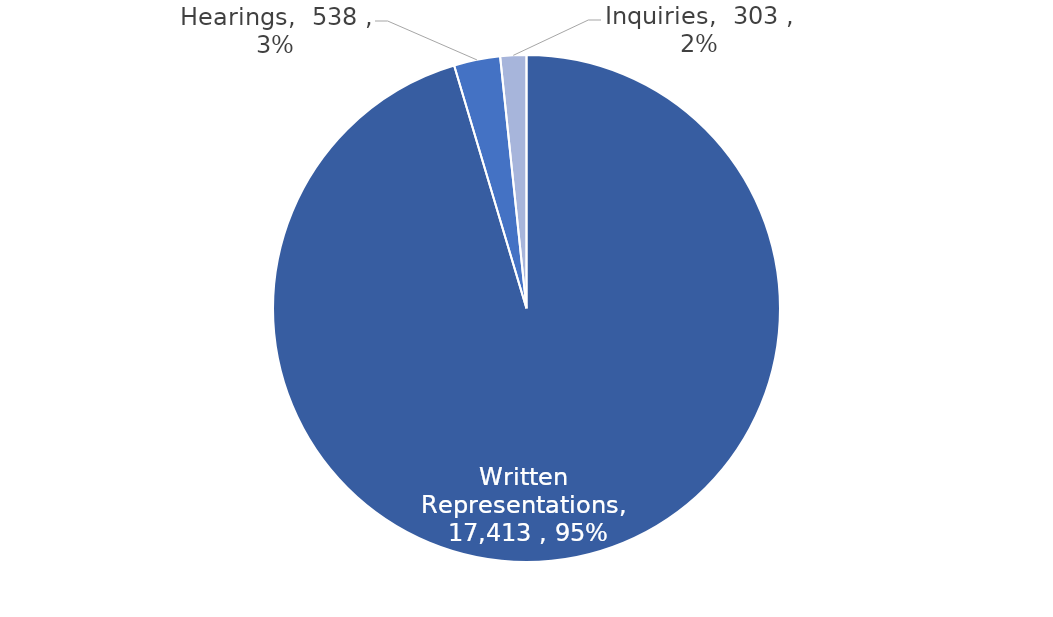
| Category | Series 0 |
|---|---|
| Written Representations | 17413 |
| Hearings | 538 |
| Inquiries | 303 |